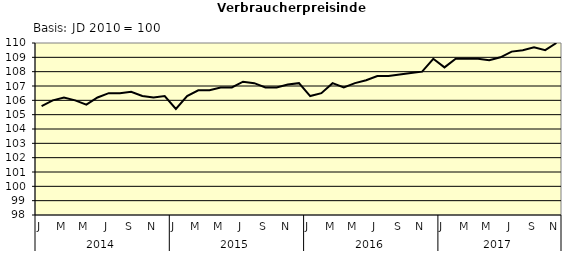
| Category | Series 0 |
|---|---|
| 0 | 105.6 |
| 1 | 106 |
| 2 | 106.2 |
| 3 | 106 |
| 4 | 105.7 |
| 5 | 106.2 |
| 6 | 106.5 |
| 7 | 106.5 |
| 8 | 106.6 |
| 9 | 106.3 |
| 10 | 106.2 |
| 11 | 106.3 |
| 12 | 105.4 |
| 13 | 106.3 |
| 14 | 106.7 |
| 15 | 106.7 |
| 16 | 106.9 |
| 17 | 106.9 |
| 18 | 107.3 |
| 19 | 107.2 |
| 20 | 106.9 |
| 21 | 106.9 |
| 22 | 107.1 |
| 23 | 107.2 |
| 24 | 106.3 |
| 25 | 106.5 |
| 26 | 107.2 |
| 27 | 106.9 |
| 28 | 107.2 |
| 29 | 107.4 |
| 30 | 107.7 |
| 31 | 107.7 |
| 32 | 107.8 |
| 33 | 107.9 |
| 34 | 108 |
| 35 | 108.9 |
| 36 | 108.3 |
| 37 | 108.9 |
| 38 | 108.9 |
| 39 | 108.9 |
| 40 | 108.8 |
| 41 | 109 |
| 42 | 109.4 |
| 43 | 109.5 |
| 44 | 109.7 |
| 45 | 109.5 |
| 46 | 110 |